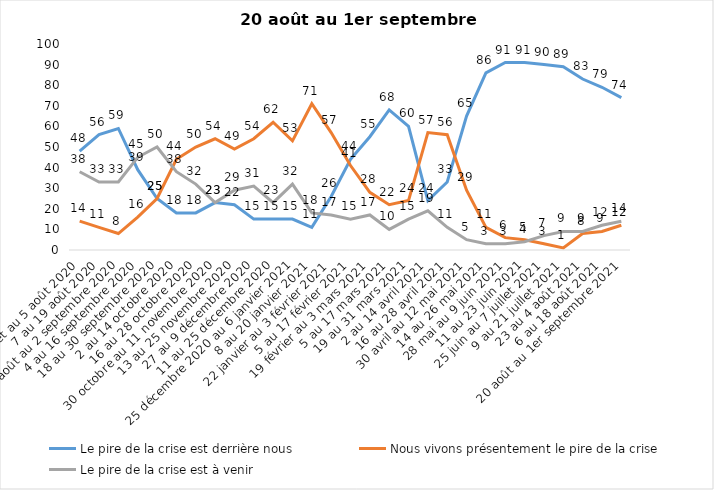
| Category | Le pire de la crise est derrière nous | Nous vivons présentement le pire de la crise | Le pire de la crise est à venir |
|---|---|---|---|
| 24 juillet au 5 août 2020 | 48 | 14 | 38 |
| 7 au 19 août 2020 | 56 | 11 | 33 |
| 21 août au 2 septembre 2020 | 59 | 8 | 33 |
| 4 au 16 septembre 2020 | 39 | 16 | 45 |
| 18 au 30 septembre 2020 | 25 | 25 | 50 |
| 2 au 14 octobre 2020 | 18 | 44 | 38 |
| 16 au 28 octobre 2020 | 18 | 50 | 32 |
| 30 octobre au 11 novembre 2020 | 23 | 54 | 23 |
| 13 au 25 novembre 2020 | 22 | 49 | 29 |
| 27 au 9 décembre 2020 | 15 | 54 | 31 |
| 11 au 25 décembre 2020 | 15 | 62 | 23 |
| 25 décembre 2020 au 6 janvier 2021 | 15 | 53 | 32 |
| 8 au 20 janvier 2021 | 11 | 71 | 18 |
| 22 janvier au 3 février 2021 | 26 | 57 | 17 |
| 5 au 17 février 2021 | 44 | 41 | 15 |
| 19 février au 3 mars 2021 | 55 | 28 | 17 |
| 5 au 17 mars 2021 | 68 | 22 | 10 |
| 19 au 31 mars 2021 | 60 | 24 | 15 |
| 2 au 14 avril 2021 | 24 | 57 | 19 |
| 16 au 28 avril 2021 | 33 | 56 | 11 |
| 30 avril au 12 mai 2021 | 65 | 29 | 5 |
| 14 au 26 mai 2021 | 86 | 11 | 3 |
| 28 mai au 9 juin 2021 | 91 | 6 | 3 |
| 11 au 23 juin 2021 | 91 | 5 | 4 |
| 25 juin au 7 juillet 2021 | 90 | 3 | 7 |
| 9 au 21 juillet 2021 | 89 | 1 | 9 |
| 23 au 4 août 2021 | 83 | 8 | 9 |
| 6 au 18 août 2021 | 79 | 9 | 12 |
| 20 août au 1er septembre 2021 | 74 | 12 | 14 |